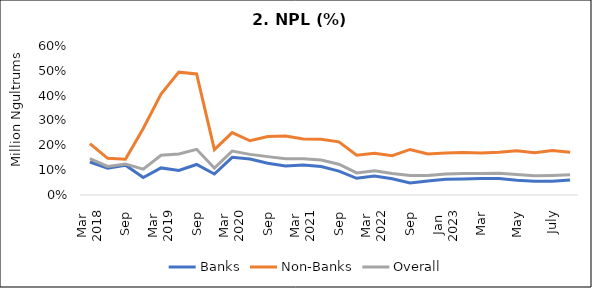
| Category | Banks | Non-Banks | Overall |
|---|---|---|---|
| 0 | 0.133 | 0.207 | 0.146 |
| 1 | 0.108 | 0.148 | 0.115 |
| 2 | 0.12 | 0.144 | 0.124 |
| 3 | 0.07 | 0.268 | 0.104 |
| 4 | 0.109 | 0.406 | 0.16 |
| 5 | 0.099 | 0.495 | 0.165 |
| 6 | 0.123 | 0.487 | 0.184 |
| 7 | 0.084 | 0.183 | 0.109 |
| 8 | 0.152 | 0.251 | 0.177 |
| 9 | 0.145 | 0.218 | 0.164 |
| 10 | 0.128 | 0.235 | 0.154 |
| 11 | 0.117 | 0.237 | 0.146 |
| 12 | 0.121 | 0.226 | 0.146 |
| 13 | 0.115 | 0.224 | 0.141 |
| 14 | 0.096 | 0.214 | 0.124 |
| 15 | 0.067 | 0.16 | 0.089 |
| 16 | 0.077 | 0.168 | 0.098 |
| 17 | 0.065 | 0.158 | 0.086 |
| 18 | 0.048 | 0.183 | 0.078 |
| 19 | 0.057 | 0.165 | 0.079 |
| 20 | 0.063 | 0.169 | 0.085 |
| 21 | 0.065 | 0.171 | 0.086 |
| 22 | 0.066 | 0.169 | 0.087 |
| 23 | 0.066 | 0.173 | 0.087 |
| 24 | 0.06 | 0.178 | 0.082 |
| 25 | 0.055 | 0.17 | 0.077 |
| 26 | 0.056 | 0.179 | 0.079 |
| 27 | 0.06 | 0.172 | 0.081 |